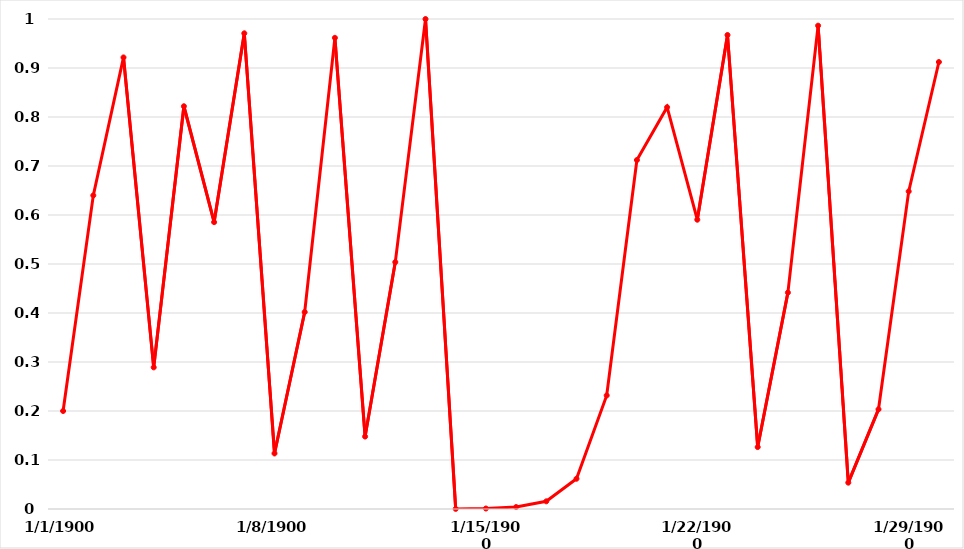
| Category | Series 4 |
|---|---|
| 0 | 0.2 |
| 1 | 0.64 |
| 2 | 0.922 |
| 3 | 0.289 |
| 4 | 0.822 |
| 5 | 0.585 |
| 6 | 0.971 |
| 7 | 0.113 |
| 8 | 0.402 |
| 9 | 0.962 |
| 10 | 0.148 |
| 11 | 0.504 |
| 12 | 1 |
| 13 | 0 |
| 14 | 0.001 |
| 15 | 0.004 |
| 16 | 0.016 |
| 17 | 0.062 |
| 18 | 0.232 |
| 19 | 0.712 |
| 20 | 0.82 |
| 21 | 0.59 |
| 22 | 0.967 |
| 23 | 0.126 |
| 24 | 0.442 |
| 25 | 0.986 |
| 26 | 0.054 |
| 27 | 0.203 |
| 28 | 0.648 |
| 29 | 0.912 |